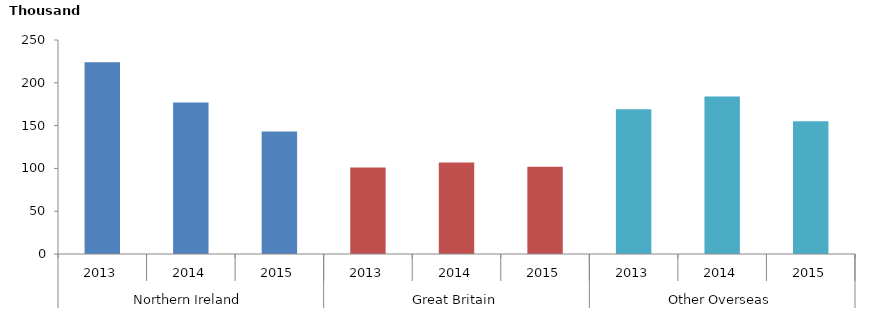
| Category | Number Thousands |
|---|---|
| 0 | 224 |
| 1 | 177 |
| 2 | 143 |
| 3 | 101 |
| 4 | 107 |
| 5 | 102 |
| 6 | 169 |
| 7 | 184 |
| 8 | 155 |